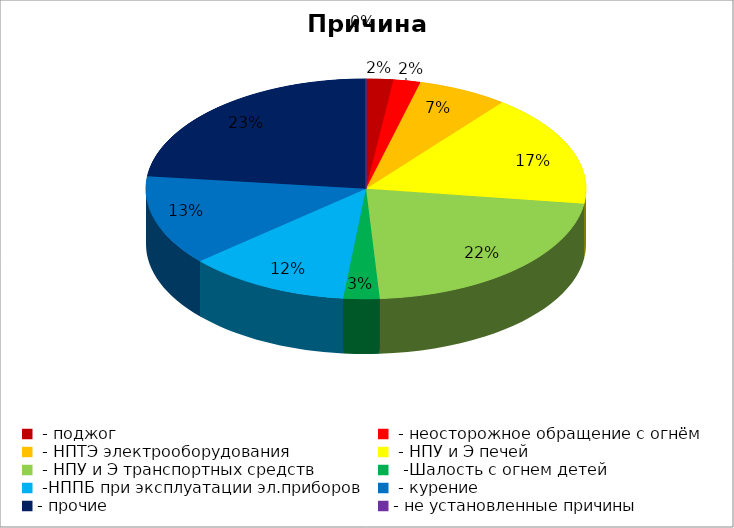
| Category | Причина пожара |
|---|---|
|  - поджог | 3 |
|  - неосторожное обращение с огнём | 3 |
|  - НПТЭ электрооборудования | 10 |
|  - НПУ и Э печей | 25 |
|  - НПУ и Э транспортных средств | 33 |
|   -Шалость с огнем детей | 4 |
|  -НППБ при эксплуатации эл.приборов | 18 |
|  - курение | 20 |
| - прочие | 35 |
| - не установленные причины | 0 |